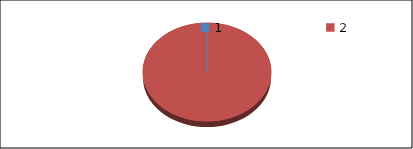
| Category | Series1 |
|---|---|
| 0 | 0 |
| 1 | 366.5 |